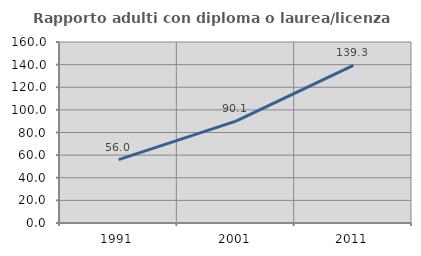
| Category | Rapporto adulti con diploma o laurea/licenza media  |
|---|---|
| 1991.0 | 55.98 |
| 2001.0 | 90.107 |
| 2011.0 | 139.316 |